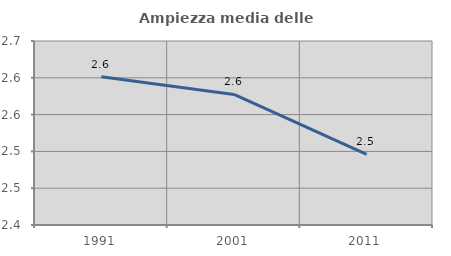
| Category | Ampiezza media delle famiglie |
|---|---|
| 1991.0 | 2.601 |
| 2001.0 | 2.577 |
| 2011.0 | 2.496 |